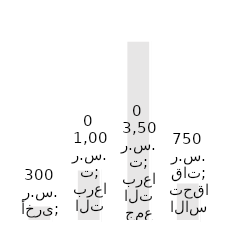
| Category | الإيراد السنوي |
|---|---|
| الاستحقاقات | 750 |
| حملات جمع التبرعات | 3500 |
| التبرعات | 1000 |
| أخرى | 300 |